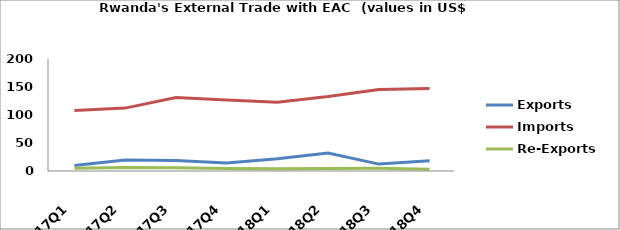
| Category | Exports | Imports | Re-Exports |
|---|---|---|---|
| 2017Q1 | 9.664 | 107.939 | 4.884 |
| 2017Q2 | 19.646 | 112.299 | 6.46 |
| 2017Q3 | 18.919 | 131.397 | 5.955 |
| 2017Q4 | 14.466 | 126.939 | 4.636 |
| 2018Q1 | 21.787 | 122.952 | 3.88 |
| 2018Q2 | 31.913 | 132.868 | 4.622 |
| 2018Q3 | 12.298 | 145.348 | 4.725 |
| 2018Q4 | 18.335 | 147.432 | 2.99 |